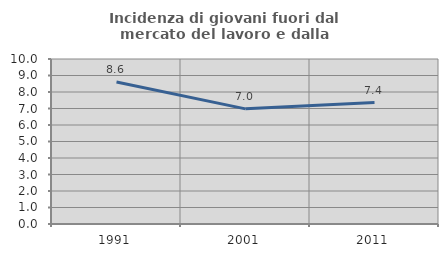
| Category | Incidenza di giovani fuori dal mercato del lavoro e dalla formazione  |
|---|---|
| 1991.0 | 8.608 |
| 2001.0 | 6.979 |
| 2011.0 | 7.361 |